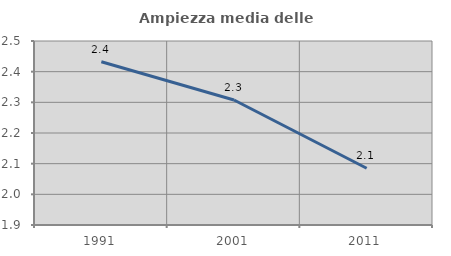
| Category | Ampiezza media delle famiglie |
|---|---|
| 1991.0 | 2.432 |
| 2001.0 | 2.308 |
| 2011.0 | 2.085 |